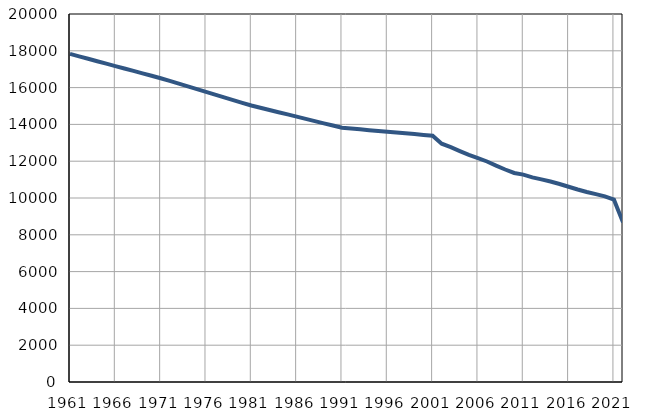
| Category | Број
становника |
|---|---|
| 1961.0 | 17831 |
| 1962.0 | 17699 |
| 1963.0 | 17567 |
| 1964.0 | 17434 |
| 1965.0 | 17302 |
| 1966.0 | 17170 |
| 1967.0 | 17038 |
| 1968.0 | 16906 |
| 1969.0 | 16773 |
| 1970.0 | 16641 |
| 1971.0 | 16509 |
| 1972.0 | 16361 |
| 1973.0 | 16212 |
| 1974.0 | 16063 |
| 1975.0 | 15915 |
| 1976.0 | 15768 |
| 1977.0 | 15619 |
| 1978.0 | 15471 |
| 1979.0 | 15323 |
| 1980.0 | 15174 |
| 1981.0 | 15026 |
| 1982.0 | 14905 |
| 1983.0 | 14783 |
| 1984.0 | 14663 |
| 1985.0 | 14542 |
| 1986.0 | 14421 |
| 1987.0 | 14300 |
| 1988.0 | 14179 |
| 1989.0 | 14058 |
| 1990.0 | 13937 |
| 1991.0 | 13816 |
| 1992.0 | 13773 |
| 1993.0 | 13731 |
| 1994.0 | 13688 |
| 1995.0 | 13646 |
| 1996.0 | 13602 |
| 1997.0 | 13559 |
| 1998.0 | 13516 |
| 1999.0 | 13473 |
| 2000.0 | 13430 |
| 2001.0 | 13388 |
| 2002.0 | 12953 |
| 2003.0 | 12762 |
| 2004.0 | 12550 |
| 2005.0 | 12346 |
| 2006.0 | 12170 |
| 2007.0 | 11985 |
| 2008.0 | 11757 |
| 2009.0 | 11549 |
| 2010.0 | 11361 |
| 2011.0 | 11273 |
| 2012.0 | 11121 |
| 2013.0 | 11011 |
| 2014.0 | 10895 |
| 2015.0 | 10761 |
| 2016.0 | 10610 |
| 2017.0 | 10461 |
| 2018.0 | 10325 |
| 2019.0 | 10209 |
| 2020.0 | 10089 |
| 2021.0 | 9910 |
| 2022.0 | 8681 |